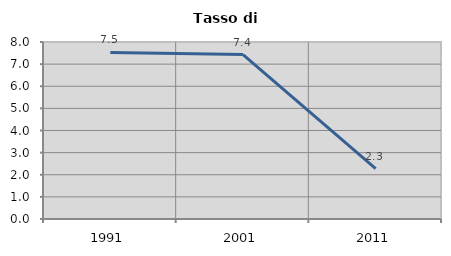
| Category | Tasso di disoccupazione   |
|---|---|
| 1991.0 | 7.527 |
| 2001.0 | 7.43 |
| 2011.0 | 2.279 |